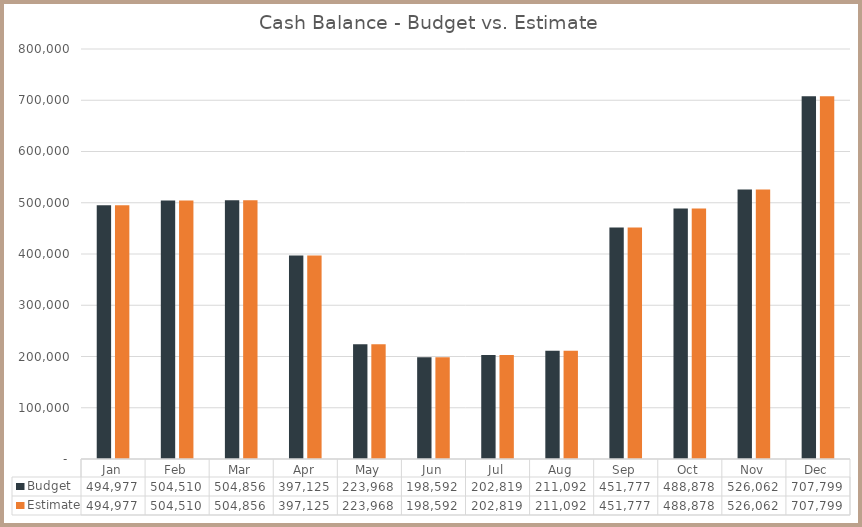
| Category | Budget | Estimate |
|---|---|---|
| Jan | 494977.169 | 494977.169 |
| Feb | 504509.602 | 504509.602 |
| Mar | 504856.389 | 504856.389 |
| Apr | 397124.843 | 397124.843 |
| May | 223967.686 | 223967.686 |
| Jun | 198592.293 | 198592.293 |
| Jul | 202818.577 | 202818.577 |
| Aug | 211091.817 | 211091.817 |
| Sep | 451776.9 | 451776.9 |
| Oct | 488877.604 | 488877.604 |
| Nov | 526062.319 | 526062.319 |
| Dec | 707798.659 | 707798.659 |